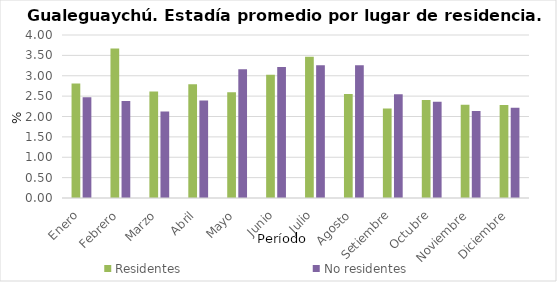
| Category | Residentes | No residentes |
|---|---|---|
| Enero | 2.809 | 2.472 |
| Febrero | 3.668 | 2.382 |
| Marzo | 2.612 | 2.123 |
| Abril | 2.791 | 2.393 |
| Mayo | 2.596 | 3.161 |
| Junio | 3.024 | 3.217 |
| Julio | 3.468 | 3.26 |
| Agosto | 2.551 | 3.258 |
| Setiembre | 2.196 | 2.545 |
| Octubre | 2.403 | 2.36 |
| Noviembre | 2.286 | 2.136 |
| Diciembre | 2.281 | 2.212 |